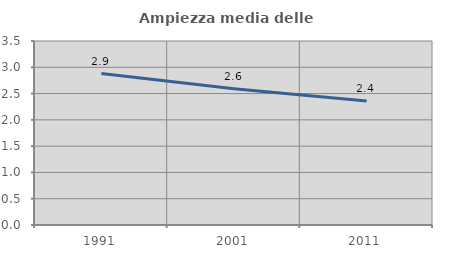
| Category | Ampiezza media delle famiglie |
|---|---|
| 1991.0 | 2.88 |
| 2001.0 | 2.59 |
| 2011.0 | 2.36 |